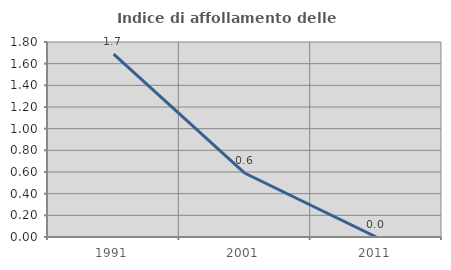
| Category | Indice di affollamento delle abitazioni  |
|---|---|
| 1991.0 | 1.688 |
| 2001.0 | 0.588 |
| 2011.0 | 0 |